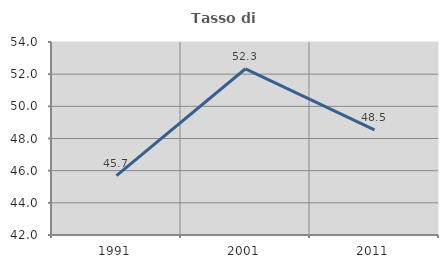
| Category | Tasso di occupazione   |
|---|---|
| 1991.0 | 45.691 |
| 2001.0 | 52.335 |
| 2011.0 | 48.534 |